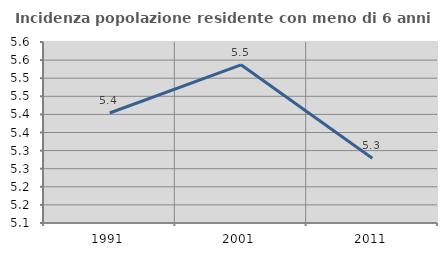
| Category | Incidenza popolazione residente con meno di 6 anni |
|---|---|
| 1991.0 | 5.404 |
| 2001.0 | 5.537 |
| 2011.0 | 5.279 |